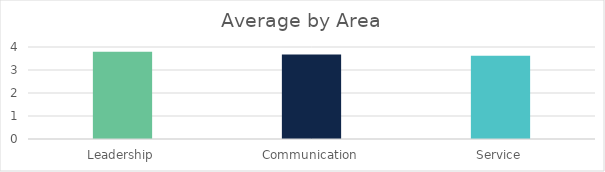
| Category | Series 0 |
|---|---|
| Leadership | 3.79 |
| Communication | 3.67 |
| Service | 3.62 |